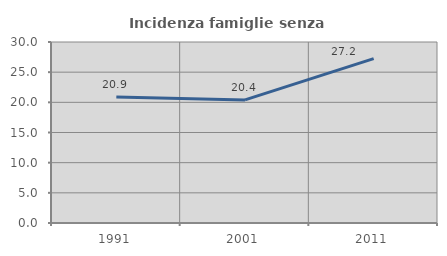
| Category | Incidenza famiglie senza nuclei |
|---|---|
| 1991.0 | 20.89 |
| 2001.0 | 20.403 |
| 2011.0 | 27.243 |